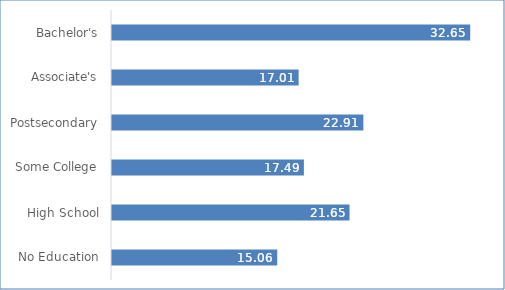
| Category | Series 0 |
|---|---|
| No Education | 15.06 |
| High School | 21.65 |
| Some College | 17.49 |
| Postsecondary | 22.91 |
| Associate's | 17.01 |
| Bachelor's | 32.65 |